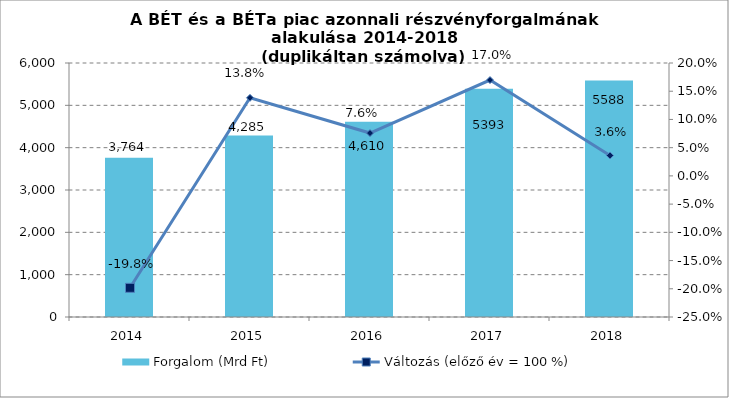
| Category | Forgalom (Mrd Ft) |
|---|---|
| 2014.0 | 3764 |
| 2015.0 | 4284.718 |
| 2016.0 | 4610 |
| 2017.0 | 5393 |
| 2018.0 | 5588 |